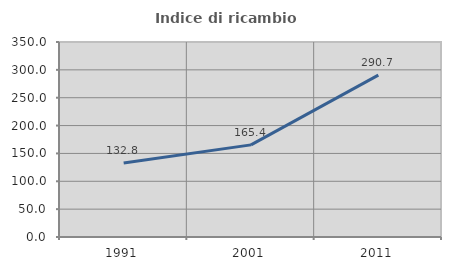
| Category | Indice di ricambio occupazionale  |
|---|---|
| 1991.0 | 132.794 |
| 2001.0 | 165.368 |
| 2011.0 | 290.657 |